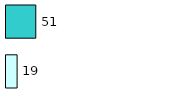
| Category | Series 0 | Series 1 |
|---|---|---|
| 0 | 19 | 51 |